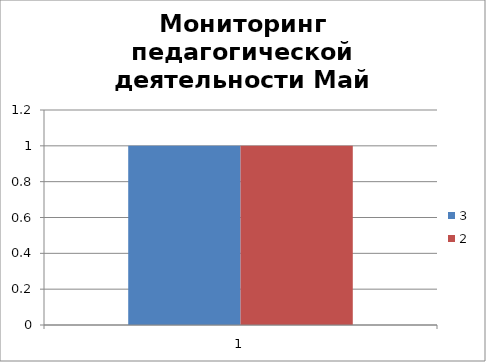
| Category | 3 | 2 |
|---|---|---|
| 0 | 1 | 1 |